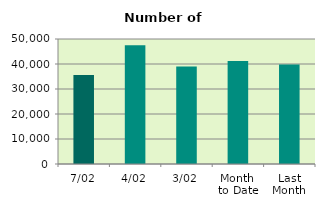
| Category | Series 0 |
|---|---|
| 7/02 | 35606 |
| 4/02 | 47548 |
| 3/02 | 39002 |
| Month 
to Date | 41166 |
| Last
Month | 39786.667 |